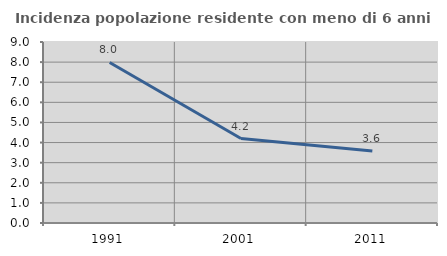
| Category | Incidenza popolazione residente con meno di 6 anni |
|---|---|
| 1991.0 | 7.983 |
| 2001.0 | 4.201 |
| 2011.0 | 3.582 |